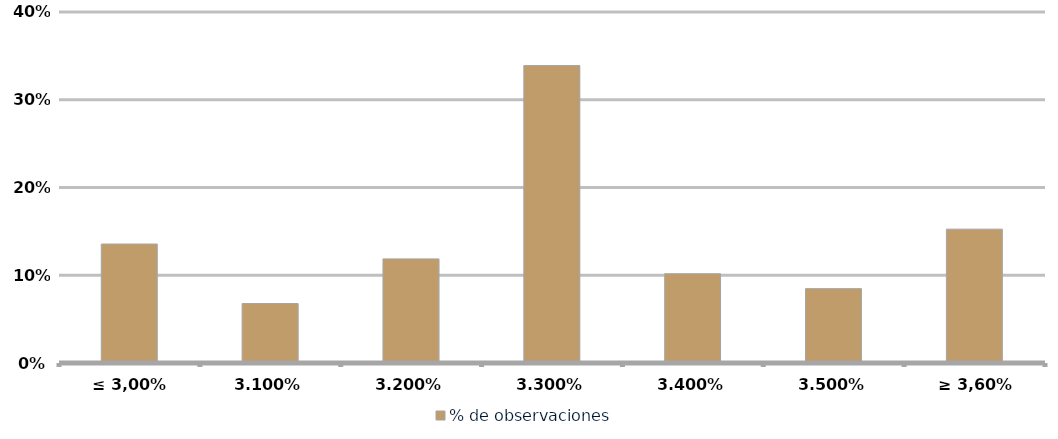
| Category | % de observaciones  |
|---|---|
| ≤ 3,00% | 0.136 |
| 3.10% | 0.068 |
| 3.20% | 0.119 |
| 3.30% | 0.339 |
| 3.40% | 0.102 |
| 3.50% | 0.085 |
| ≥ 3,60% | 0.153 |